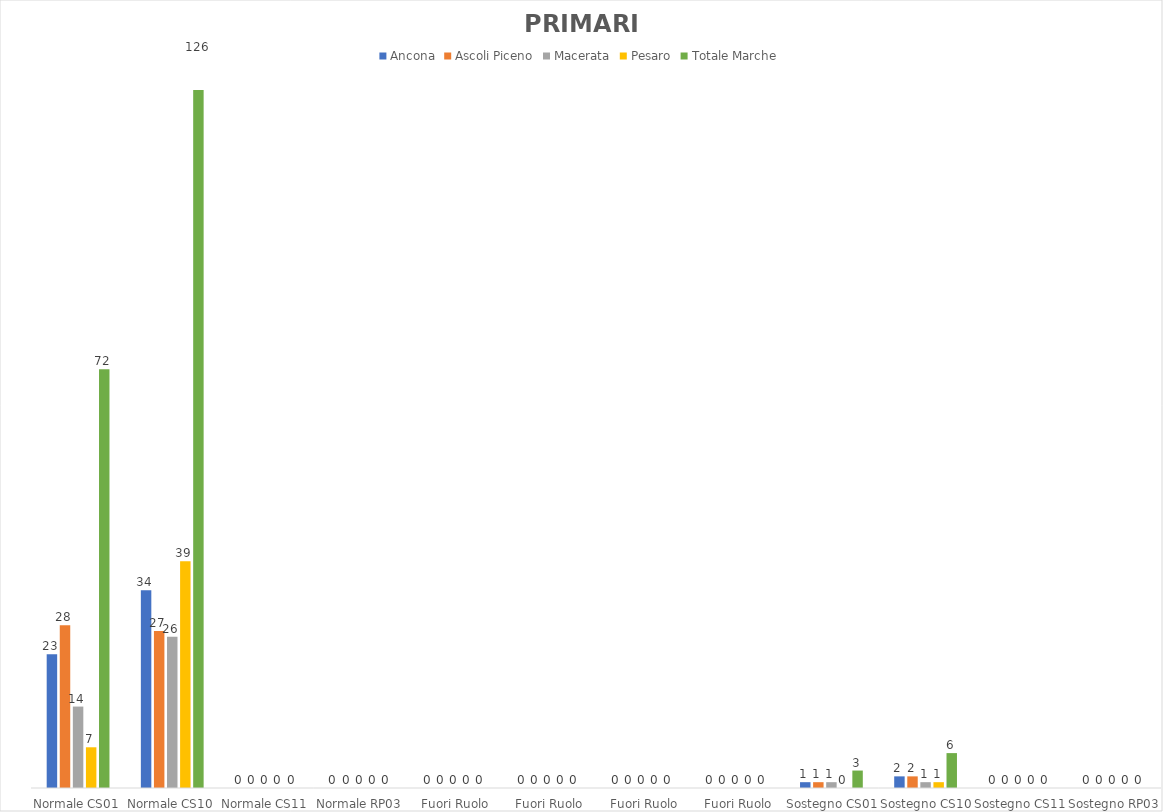
| Category | Ancona | Ascoli Piceno | Macerata | Pesaro | Totale Marche |
|---|---|---|---|---|---|
| Normale CS01 | 23 | 28 | 14 | 7 | 72 |
| Normale CS10 | 34 | 27 | 26 | 39 | 126 |
| Normale CS11 | 0 | 0 | 0 | 0 | 0 |
| Normale RP03 | 0 | 0 | 0 | 0 | 0 |
| Fuori Ruolo CS01 | 0 | 0 | 0 | 0 | 0 |
| Fuori Ruolo CS10 | 0 | 0 | 0 | 0 | 0 |
| Fuori Ruolo CS11 | 0 | 0 | 0 | 0 | 0 |
| Fuori Ruolo RP03 | 0 | 0 | 0 | 0 | 0 |
| Sostegno CS01 | 1 | 1 | 1 | 0 | 3 |
| Sostegno CS10 | 2 | 2 | 1 | 1 | 6 |
| Sostegno CS11 | 0 | 0 | 0 | 0 | 0 |
| Sostegno RP03 | 0 | 0 | 0 | 0 | 0 |